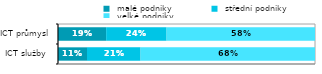
| Category |  malé podniky |  střední podniky |  velké podniky |
|---|---|---|---|
| ICT služby  | 0.113 | 0.209 | 0.679 |
| ICT průmysl | 0.187 | 0.235 | 0.577 |